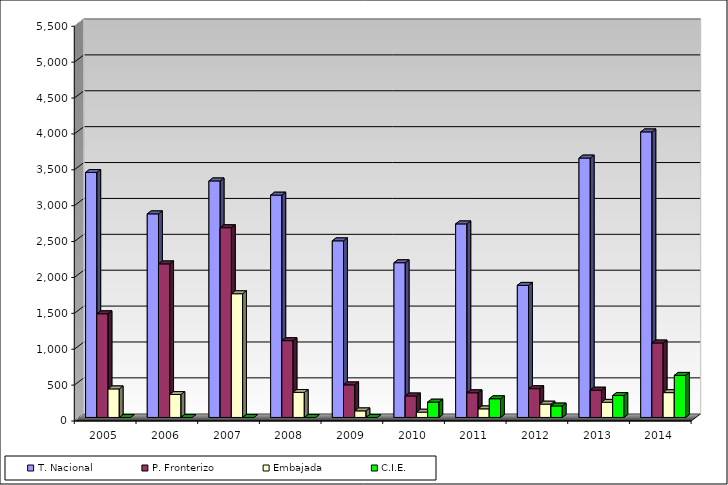
| Category | T. Nacional | P. Fronterizo | Embajada | C.I.E. |
|---|---|---|---|---|
| 2005.0 | 3414 | 1445 | 398 | 0 |
| 2006.0 | 2837 | 2140 | 320 | 0 |
| 2007.0 | 3296 | 2644 | 1724 | 0 |
| 2008.0 | 3098 | 1070 | 349 | 0 |
| 2009.0 | 2461 | 454 | 92 | 0 |
| 2010.0 | 2156 | 300 | 74 | 214 |
| 2011.0 | 2697 | 344 | 120 | 261 |
| 2012.0 | 1841 | 401 | 186 | 160 |
| 2013.0 | 3615 | 381 | 211 | 306 |
| 2014.0 | 3979 | 1038 | 346 | 587 |